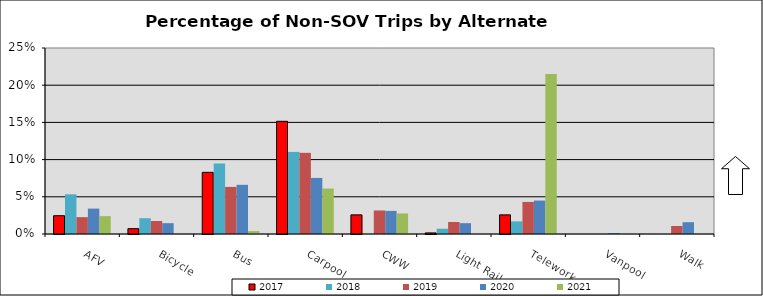
| Category | 2017 | 2018 | 2019 | 2020 | 2021 |
|---|---|---|---|---|---|
| AFV | 0.025 | 0.053 | 0.023 | 0.034 | 0.024 |
| Bicycle | 0.007 | 0.021 | 0.018 | 0.015 | 0 |
| Bus | 0.083 | 0.095 | 0.063 | 0.066 | 0.004 |
| Carpool | 0.151 | 0.11 | 0.109 | 0.075 | 0.061 |
| CWW | 0.026 | 0 | 0.032 | 0.031 | 0.028 |
| Light Rail | 0.001 | 0.007 | 0.016 | 0.015 | 0 |
| Telework | 0.026 | 0.017 | 0.043 | 0.045 | 0.215 |
| Vanpool | 0 | 0 | 0 | 0.001 | 0 |
| Walk | 0 | 0 | 0.011 | 0.016 | 0 |